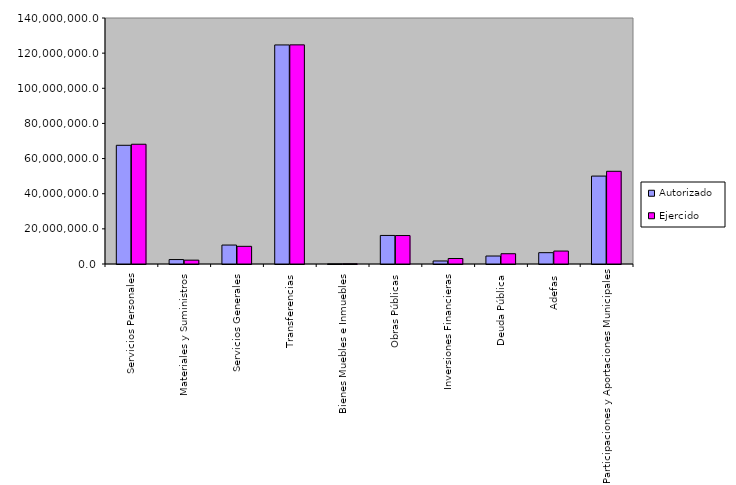
| Category | Autorizado | Ejercido |
|---|---|---|
| 0 | 67555296.6 | 68155602.8 |
| 1 | 2531108.6 | 2195920 |
| 2 | 10779101.4 | 10049591.2 |
| 3 | 124668846.9 | 124710795.2 |
| 4 | 85214.2 | 155348.8 |
| 5 | 16247297.2 | 16195293.5 |
| 6 | 1722832 | 3124712.9 |
| 7 | 4541774.766 | 5849927 |
| 8 | 6442504.4 | 7362958.8 |
| 9 | 50035957.4 | 52760431.1 |